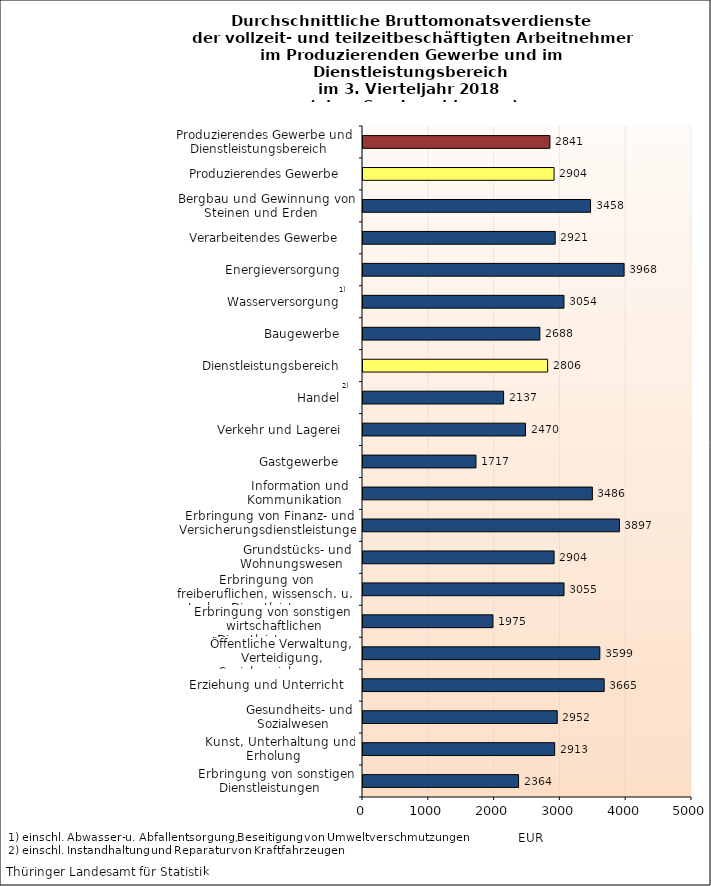
| Category | Series 0 |
|---|---|
| Erbringung von sonstigen Dienstleistungen    | 2364 |
| Kunst, Unterhaltung und Erholung    | 2913 |
| Gesundheits- und Sozialwesen    | 2952 |
| Erziehung und Unterricht    | 3665 |
| Öffentliche Verwaltung, Verteidigung, Sozialversicherung    | 3599 |
| Erbringung von sonstigen  wirtschaftlichen Dienstleistungen    | 1975 |
| Erbringung von freiberuflichen, wissensch. u. techn. Dienstleistungen    | 3055 |
| Grundstücks- und Wohnungswesen    | 2904 |
| Erbringung von Finanz- und Versicherungsdienstleistungen    | 3897 |
| Information und Kommunikation    | 3486 |
| Gastgewerbe    | 1717 |
| Verkehr und Lagerei    | 2470 |
| Handel    | 2137 |
| Dienstleistungsbereich    | 2806 |
| Baugewerbe    | 2688 |
| Wasserversorgung    | 3054 |
| Energieversorgung    | 3968 |
| Verarbeitendes Gewerbe    | 2921 |
| Bergbau und Gewinnung von Steinen und Erden    | 3458 |
| Produzierendes Gewerbe    | 2904 |
| Produzierendes Gewerbe und Dienstleistungsbereich    | 2841 |